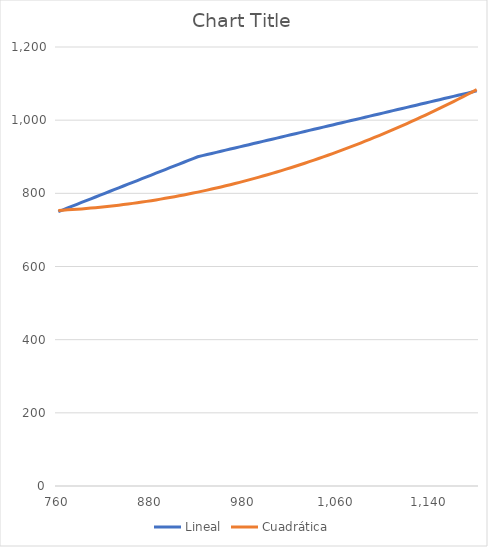
| Category | Lineal | Cuadrática |
|---|---|---|
| 760.0 | 750 | 753.333 |
| 766.0 | 755 | 754.033 |
| 772.0 | 760 | 754.8 |
| 778.0 | 765 | 755.633 |
| 784.0 | 770 | 756.533 |
| 790.0 | 775 | 757.5 |
| 796.0 | 780 | 758.533 |
| 802.0 | 785 | 759.633 |
| 808.0 | 790 | 760.8 |
| 814.0 | 795 | 762.033 |
| 820.0 | 800 | 763.333 |
| 826.0 | 805 | 764.7 |
| 832.0 | 810 | 766.133 |
| 838.0 | 815 | 767.633 |
| 844.0 | 820 | 769.2 |
| 850.0 | 825 | 770.833 |
| 856.0 | 830 | 772.533 |
| 862.0 | 835 | 774.3 |
| 868.0 | 840 | 776.133 |
| 874.0 | 845 | 778.033 |
| 880.0 | 850 | 780 |
| 886.0 | 855 | 782.033 |
| 892.0 | 860 | 784.133 |
| 898.0 | 865 | 786.3 |
| 904.0 | 870 | 788.533 |
| 910.0 | 875 | 790.833 |
| 916.0 | 880 | 793.2 |
| 922.0 | 885 | 795.633 |
| 928.0 | 890 | 798.133 |
| 934.0 | 895 | 800.7 |
| 940.0 | 900 | 803.333 |
| 944.0 | 903 | 806.033 |
| 948.0 | 906 | 808.8 |
| 952.0 | 909 | 811.633 |
| 956.0 | 912 | 814.533 |
| 960.0 | 915 | 817.5 |
| 964.0 | 918 | 820.533 |
| 968.0 | 921 | 823.633 |
| 972.0 | 924 | 826.8 |
| 976.0 | 927 | 830.033 |
| 980.0 | 930 | 833.333 |
| 984.0 | 933 | 836.7 |
| 988.0 | 936 | 840.133 |
| 992.0 | 939 | 843.633 |
| 996.0 | 942 | 847.2 |
| 1000.0 | 945 | 850.833 |
| 1004.0 | 948 | 854.533 |
| 1008.0 | 951 | 858.3 |
| 1012.0 | 954 | 862.133 |
| 1016.0 | 957 | 866.033 |
| 1020.0 | 960 | 870 |
| 1024.0 | 963 | 874.033 |
| 1028.0 | 966 | 878.133 |
| 1032.0 | 969 | 882.3 |
| 1036.0 | 972 | 886.533 |
| 1040.0 | 975 | 890.833 |
| 1044.0 | 978 | 895.2 |
| 1048.0 | 981 | 899.633 |
| 1052.0 | 984 | 904.133 |
| 1056.0 | 987 | 908.7 |
| 1060.0 | 990 | 913.333 |
| 1064.0 | 993 | 918.033 |
| 1068.0 | 996 | 922.8 |
| 1072.0 | 999 | 927.633 |
| 1076.0 | 1002 | 932.533 |
| 1080.0 | 1005 | 937.5 |
| 1084.0 | 1008 | 942.533 |
| 1088.0 | 1011 | 947.633 |
| 1092.0 | 1014 | 952.8 |
| 1096.0 | 1017 | 958.033 |
| 1100.0 | 1020 | 963.333 |
| 1104.0 | 1023 | 968.7 |
| 1108.0 | 1026 | 974.133 |
| 1112.0 | 1029 | 979.633 |
| 1116.0 | 1032 | 985.2 |
| 1120.0 | 1035 | 990.833 |
| 1124.0 | 1038 | 996.533 |
| 1128.0 | 1041 | 1002.3 |
| 1132.0 | 1044 | 1008.133 |
| 1136.0 | 1047 | 1014.033 |
| 1140.0 | 1050 | 1020 |
| 1144.0 | 1053 | 1026.033 |
| 1148.0 | 1056 | 1032.133 |
| 1152.0 | 1059 | 1038.3 |
| 1156.0 | 1062 | 1044.533 |
| 1160.0 | 1065 | 1050.833 |
| 1164.0 | 1068 | 1057.2 |
| 1168.0 | 1071 | 1063.633 |
| 1172.0 | 1074 | 1070.133 |
| 1176.0 | 1077 | 1076.7 |
| 1180.0 | 1080 | 1083.333 |